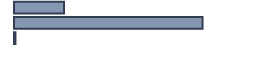
| Category | Percentatge |
|---|---|
| 0 | 20.833 |
| 1 | 78.561 |
| 2 | 0.606 |
| 3 | 0 |